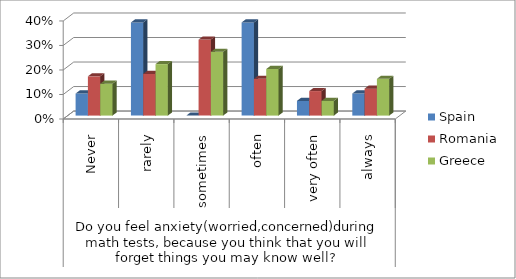
| Category | Spain | Romania | Greece |
|---|---|---|---|
| 0 | 0.09 | 0.16 | 0.13 |
| 1 | 0.38 | 0.17 | 0.21 |
| 2 | 0 | 0.31 | 0.26 |
| 3 | 0.38 | 0.15 | 0.19 |
| 4 | 0.06 | 0.1 | 0.06 |
| 5 | 0.09 | 0.11 | 0.15 |